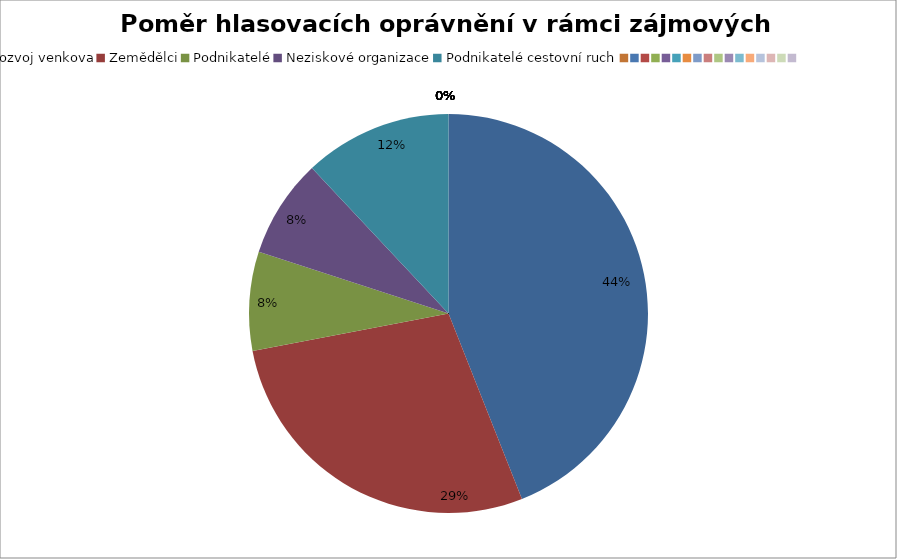
| Category | Series 0 |
|---|---|
| Rozvoj venkova | 0.44 |
| Zemědělci | 0.28 |
| Podnikatelé | 0.08 |
| Neziskové organizace | 0.08 |
| Podnikatelé cestovní ruch | 0.12 |